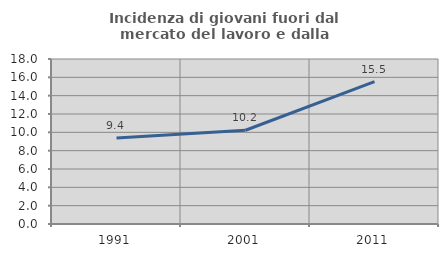
| Category | Incidenza di giovani fuori dal mercato del lavoro e dalla formazione  |
|---|---|
| 1991.0 | 9.375 |
| 2001.0 | 10.227 |
| 2011.0 | 15.534 |